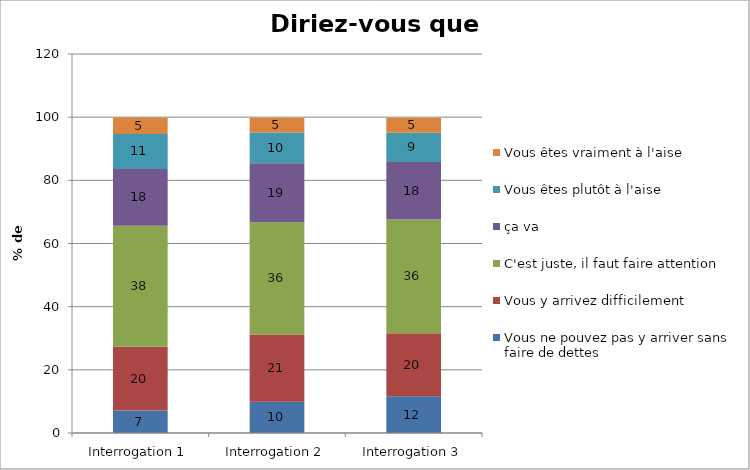
| Category | Vous ne pouvez pas y arriver sans faire de dettes | Vous y arrivez difficilement | C'est juste, il faut faire attention | ça va | Vous êtes plutôt à l'aise | Vous êtes vraiment à l'aise |
|---|---|---|---|---|---|---|
| Interrogation 1 | 7.13 | 20.15 | 38.36 | 17.96 | 11.08 | 5.21 |
| Interrogation 2 | 9.9 | 21.28 | 35.54 | 18.69 | 9.72 | 4.66 |
| Interrogation 3 | 11.64 | 19.92 | 36.07 | 18.16 | 9.27 | 4.74 |